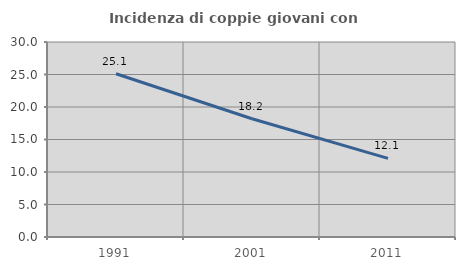
| Category | Incidenza di coppie giovani con figli |
|---|---|
| 1991.0 | 25.12 |
| 2001.0 | 18.196 |
| 2011.0 | 12.105 |